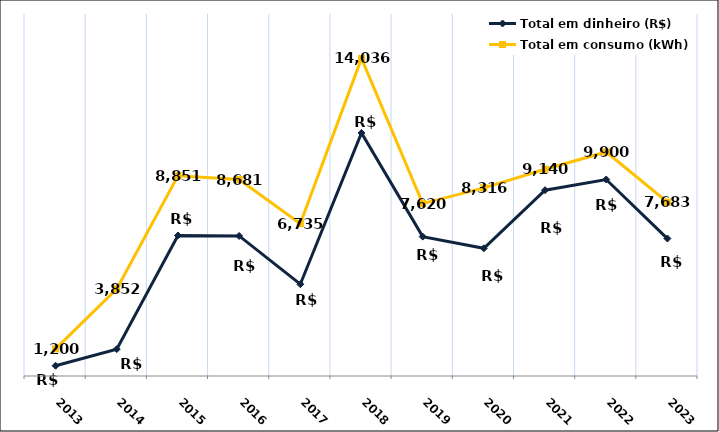
| Category | Total em dinheiro (R$) | Total em consumo (kWh) |
|---|---|---|
| 2013.0 | 453.74 | 1200 |
| 2014.0 | 1186.54 | 3852 |
| 2015.0 | 6211.94 | 8851 |
| 2016.0 | 6190.18 | 8681 |
| 2017.0 | 4057.15 | 6735 |
| 2018.0 | 10741.12 | 14036 |
| 2019.0 | 6161.02 | 7620 |
| 2020.0 | 5645.53 | 8316 |
| 2021.0 | 8213.06 | 9140 |
| 2022.0 | 8685.12 | 9900 |
| 2023.0 | 6075.13 | 7683 |